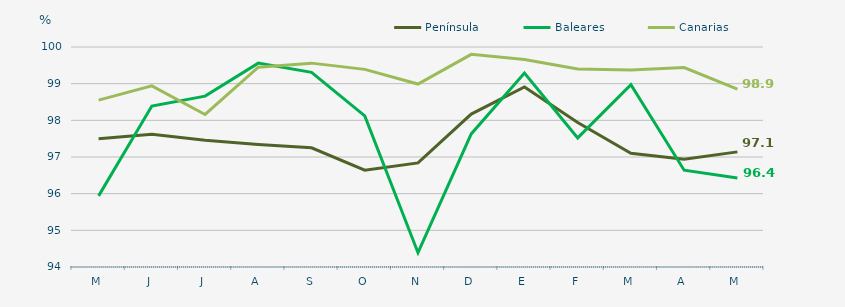
| Category | Península | Baleares | Canarias |
|---|---|---|---|
| M | 97.5 | 95.94 | 98.55 |
| J | 97.62 | 98.39 | 98.94 |
| J | 97.46 | 98.66 | 98.16 |
| A | 97.34 | 99.56 | 99.45 |
| S | 97.25 | 99.31 | 99.56 |
| O | 96.64 | 98.12 | 99.39 |
| N | 96.84 | 94.39 | 98.99 |
| D | 98.17 | 97.63 | 99.8 |
| E | 98.91 | 99.29 | 99.66 |
| F | 97.94 | 97.52 | 99.4 |
| M | 97.1 | 98.97 | 99.37 |
| A | 96.94 | 96.64 | 99.44 |
| M | 97.14 | 96.43 | 98.85 |